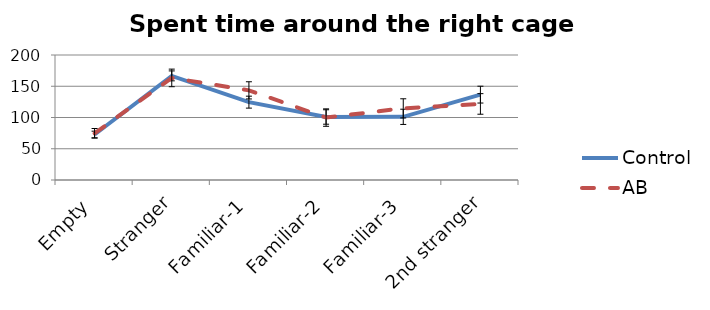
| Category | Control | AB |
|---|---|---|
| Empty | 72.759 | 74.767 |
| Stranger | 166.593 | 163.333 |
| Familiar-1 | 124.556 | 143.433 |
| Familiar-2 | 100.815 | 99.867 |
| Familiar-3 | 101.074 | 114.633 |
| 2nd stranger | 136.611 | 121.7 |